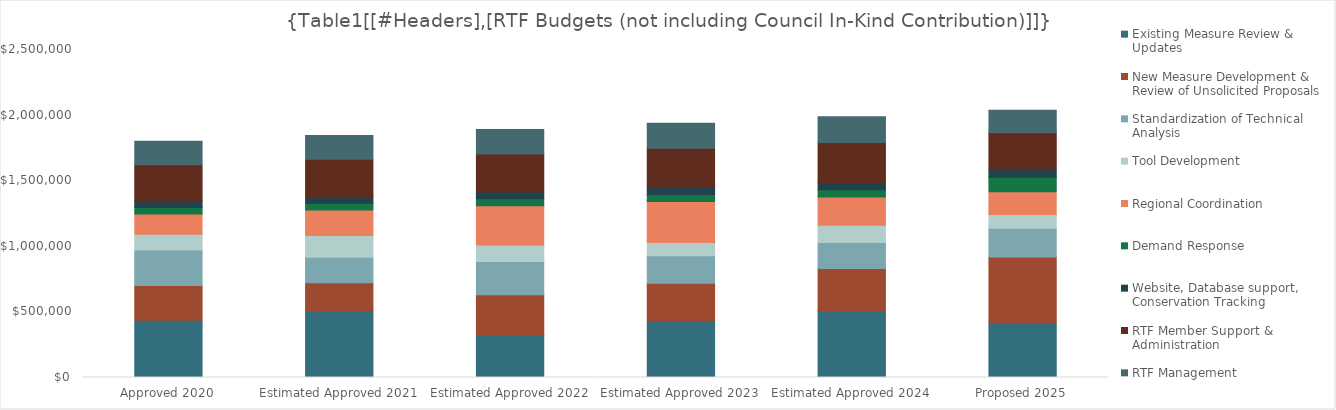
| Category | Existing Measure Review & Updates | New Measure Development & Review of Unsolicited Proposals | Standardization of Technical Analysis | Tool Development | Regional Coordination | Demand Response | Website, Database support, Conservation Tracking  | RTF Member Support & Administration | RTF Management |
|---|---|---|---|---|---|---|---|---|---|
| Approved 2020 | 437000 | 264000 | 270000 | 120000 | 155000 | 50000 | 50000 | 276000 | 178000 |
| Estimated Approved 2021 | 506400 | 215300 | 194800 | 166100 | 194800 | 51300 | 51300 | 282900 | 182500 |
| Estimated Approved 2022 | 319400 | 312000 | 252200 | 126100 | 299400 | 52500 | 52500 | 290000 | 187000 |
| Estimated Approved 2023 | 429700 | 288600 | 210000 | 101200 | 312300 | 53800 | 53800 | 297200 | 191700 |
| Estimated Approved 2024 | 503300 | 327800 | 198700 | 130200 | 215200 | 55200 | 55200 | 304700 | 196500 |
| Proposed 2025 | 418000 | 500500 | 219500 | 105000 | 172600 | 110500 | 61700 | 278200 | 170500 |